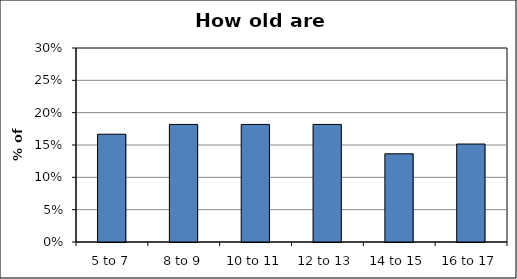
| Category | Series 0 |
|---|---|
| 5 to 7 | 0.167 |
| 8 to 9 | 0.182 |
| 10 to 11 | 0.182 |
| 12 to 13 | 0.182 |
| 14 to 15 | 0.136 |
| 16 to 17 | 0.152 |